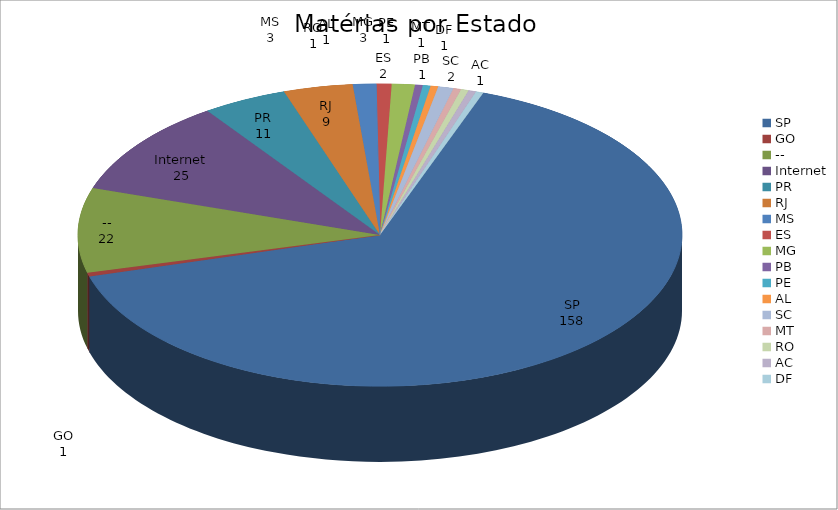
| Category | Series 0 |
|---|---|
| SP | 158 |
| GO | 1 |
| -- | 22 |
| Internet | 25 |
| PR | 11 |
| RJ | 9 |
| MS | 3 |
| ES | 2 |
| MG | 3 |
| PB | 1 |
| PE | 1 |
| AL | 1 |
| SC | 2 |
| MT | 1 |
| RO | 1 |
| AC | 1 |
| DF | 1 |